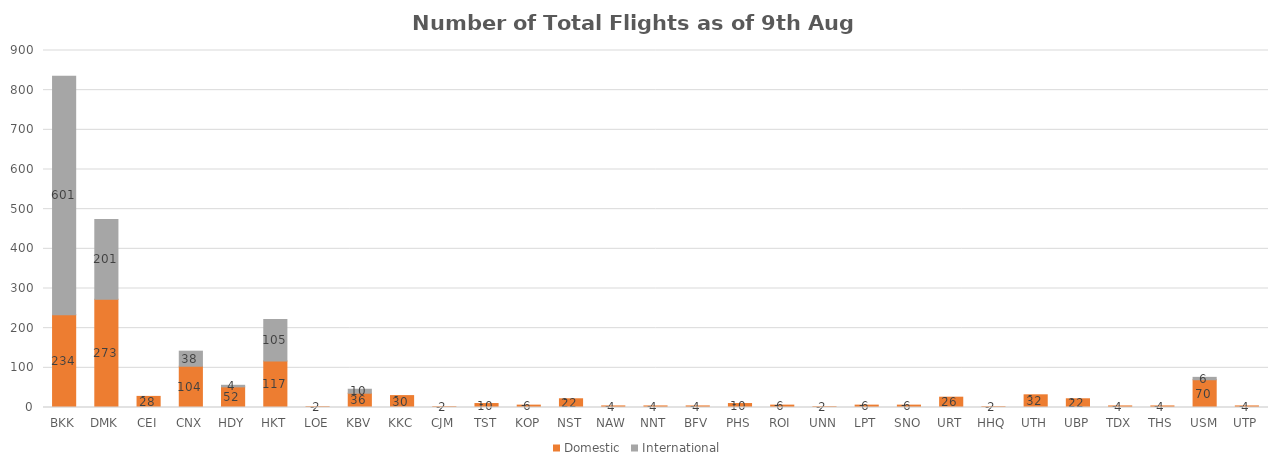
| Category | Domestic | International |
|---|---|---|
| BKK | 234 | 601 |
| DMK | 273 | 201 |
| CEI | 28 | 0 |
| CNX | 104 | 38 |
| HDY | 52 | 4 |
| HKT | 117 | 105 |
| LOE | 2 | 0 |
| KBV | 36 | 10 |
| KKC | 30 | 0 |
| CJM | 2 | 0 |
| TST | 10 | 0 |
| KOP | 6 | 0 |
| NST | 22 | 0 |
| NAW | 4 | 0 |
| NNT | 4 | 0 |
| BFV | 4 | 0 |
| PHS | 10 | 0 |
| ROI | 6 | 0 |
| UNN | 2 | 0 |
| LPT | 6 | 0 |
| SNO | 6 | 0 |
| URT | 26 | 0 |
| HHQ | 2 | 0 |
| UTH | 32 | 0 |
| UBP | 22 | 0 |
| TDX | 4 | 0 |
| THS | 4 | 0 |
| USM | 70 | 6 |
| UTP | 4 | 0 |